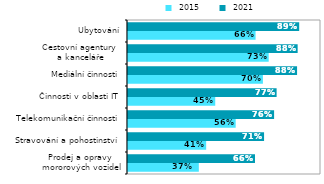
| Category |  2015 |  2021 |
|---|---|---|
| Prodej a opravy 
mororových vozidel | 0.367 | 0.658 |
| Stravování a pohostinství  | 0.405 | 0.705 |
| Telekomunikační činnosti | 0.558 | 0.757 |
| Činnosti v oblasti IT | 0.452 | 0.77 |
| Mediální činnosti | 0.699 | 0.876 |
| Cestovní agentury 
a kanceláře | 0.729 | 0.879 |
| Ubytování | 0.661 | 0.887 |